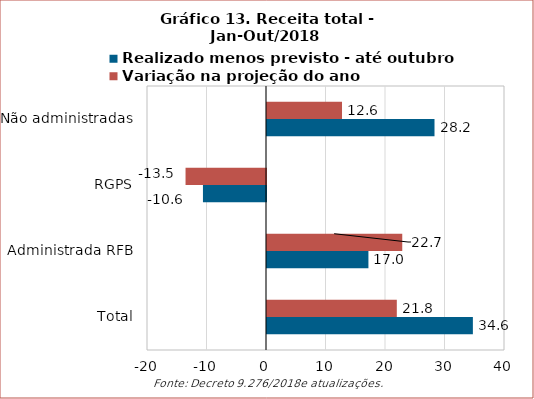
| Category | Realizado menos previsto - até outubro | Variação na projeção do ano |
|---|---|---|
| Total | 34.601 | 21.817 |
| Administrada RFB | 17.046 | 22.732 |
| RGPS | -10.597 | -13.522 |
| Não administradas | 28.152 | 12.607 |